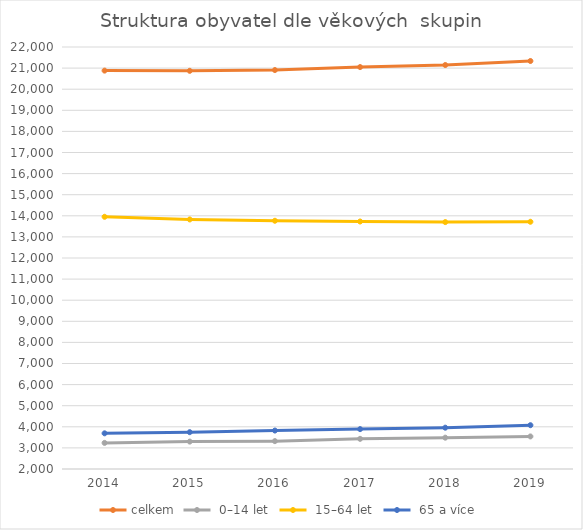
| Category | celkem |  0–14 let  |  15–64 let  |  65 a více  |
|---|---|---|---|---|
| 2019.0 | 21336 | 3543 | 13717 | 4076 |
| 2018.0 | 21145 | 3485 | 13702 | 3958 |
| 2017.0 | 21049 | 3429 | 13730 | 3890 |
| 2016.0 | 20908 | 3321 | 13765 | 3822 |
| 2015.0 | 20871 | 3299 | 13827 | 3745 |
| 2014.0 | 20881 | 3237 | 13953 | 3691 |